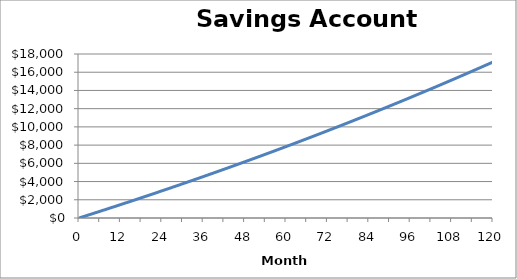
| Category | Series 0 |
|---|---|
| 0.0 | 0 |
| 1.0 | 120 |
| 2.0 | 240.34 |
| 3.0 | 361.02 |
| 4.0 | 482.04 |
| 5.0 | 603.41 |
| 6.0 | 725.12 |
| 7.0 | 847.17 |
| 8.0 | 969.57 |
| 9.0 | 1092.32 |
| 10.0 | 1215.41 |
| 11.0 | 1338.85 |
| 12.0 | 1462.64 |
| 13.0 | 1586.78 |
| 14.0 | 1711.28 |
| 15.0 | 1836.13 |
| 16.0 | 1961.33 |
| 17.0 | 2086.89 |
| 18.0 | 2212.8 |
| 19.0 | 2339.07 |
| 20.0 | 2465.7 |
| 21.0 | 2592.69 |
| 22.0 | 2720.04 |
| 23.0 | 2847.75 |
| 24.0 | 2975.82 |
| 25.0 | 3104.25 |
| 26.0 | 3233.05 |
| 27.0 | 3362.21 |
| 28.0 | 3491.74 |
| 29.0 | 3621.63 |
| 30.0 | 3751.89 |
| 31.0 | 3882.52 |
| 32.0 | 4013.52 |
| 33.0 | 4144.89 |
| 34.0 | 4276.63 |
| 35.0 | 4408.75 |
| 36.0 | 4541.24 |
| 37.0 | 4674.11 |
| 38.0 | 4807.35 |
| 39.0 | 4940.97 |
| 40.0 | 5074.97 |
| 41.0 | 5209.35 |
| 42.0 | 5344.11 |
| 43.0 | 5479.25 |
| 44.0 | 5614.77 |
| 45.0 | 5750.68 |
| 46.0 | 5886.97 |
| 47.0 | 6023.65 |
| 48.0 | 6160.72 |
| 49.0 | 6298.18 |
| 50.0 | 6436.02 |
| 51.0 | 6574.26 |
| 52.0 | 6712.89 |
| 53.0 | 6851.91 |
| 54.0 | 6991.32 |
| 55.0 | 7131.13 |
| 56.0 | 7271.33 |
| 57.0 | 7411.93 |
| 58.0 | 7552.93 |
| 59.0 | 7694.33 |
| 60.0 | 7836.13 |
| 61.0 | 7978.33 |
| 62.0 | 8120.94 |
| 63.0 | 8263.95 |
| 64.0 | 8407.36 |
| 65.0 | 8551.18 |
| 66.0 | 8695.41 |
| 67.0 | 8840.05 |
| 68.0 | 8985.1 |
| 69.0 | 9130.56 |
| 70.0 | 9276.43 |
| 71.0 | 9422.71 |
| 72.0 | 9569.41 |
| 73.0 | 9716.52 |
| 74.0 | 9864.05 |
| 75.0 | 10012 |
| 76.0 | 10160.37 |
| 77.0 | 10309.16 |
| 78.0 | 10458.37 |
| 79.0 | 10608 |
| 80.0 | 10758.06 |
| 81.0 | 10908.54 |
| 82.0 | 11059.45 |
| 83.0 | 11210.79 |
| 84.0 | 11362.55 |
| 85.0 | 11514.74 |
| 86.0 | 11667.37 |
| 87.0 | 11820.43 |
| 88.0 | 11973.92 |
| 89.0 | 12127.85 |
| 90.0 | 12282.21 |
| 91.0 | 12437.01 |
| 92.0 | 12592.25 |
| 93.0 | 12747.93 |
| 94.0 | 12904.05 |
| 95.0 | 13060.61 |
| 96.0 | 13217.62 |
| 97.0 | 13375.07 |
| 98.0 | 13532.97 |
| 99.0 | 13691.31 |
| 100.0 | 13850.1 |
| 101.0 | 14009.34 |
| 102.0 | 14169.03 |
| 103.0 | 14329.18 |
| 104.0 | 14489.78 |
| 105.0 | 14650.83 |
| 106.0 | 14812.34 |
| 107.0 | 14974.31 |
| 108.0 | 15136.74 |
| 109.0 | 15299.63 |
| 110.0 | 15462.98 |
| 111.0 | 15626.79 |
| 112.0 | 15791.07 |
| 113.0 | 15955.81 |
| 114.0 | 16121.02 |
| 115.0 | 16286.7 |
| 116.0 | 16452.85 |
| 117.0 | 16619.47 |
| 118.0 | 16786.56 |
| 119.0 | 16954.12 |
| 120.0 | 17122.16 |